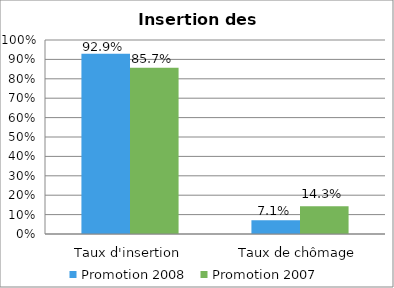
| Category | Promotion 2008 | Promotion 2007 |
|---|---|---|
| Taux d'insertion | 0.929 | 0.857 |
| Taux de chômage | 0.071 | 0.143 |